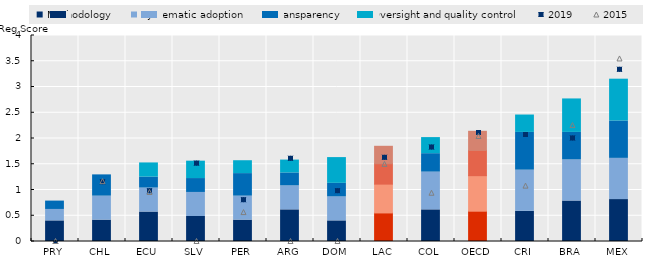
| Category | Methodology | Systematic adoption | Transparency | Oversight and quality control |
|---|---|---|---|---|
| PRY | 0.4 | 0.222 | 0.162 | 0 |
| CHL | 0.414 | 0.467 | 0.413 | 0 |
| ECU | 0.571 | 0.467 | 0.212 | 0.275 |
| SLV | 0.486 | 0.467 | 0.27 | 0.338 |
| PER | 0.414 | 0.467 | 0.438 | 0.25 |
| ARG | 0.614 | 0.467 | 0.25 | 0.25 |
| DOM | 0.4 | 0.467 | 0.262 | 0.5 |
| LAC | 0.555 | 0.56 | 0.396 | 0.339 |
| COL | 0.614 | 0.733 | 0.358 | 0.312 |
| OECD | 0.588 | 0.69 | 0.49 | 0.371 |
| CRI | 0.586 | 0.8 | 0.732 | 0.338 |
| BRA | 0.786 | 0.8 | 0.533 | 0.65 |
| MEX | 0.814 | 0.8 | 0.725 | 0.812 |